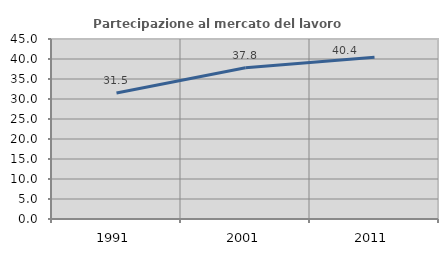
| Category | Partecipazione al mercato del lavoro  femminile |
|---|---|
| 1991.0 | 31.522 |
| 2001.0 | 37.833 |
| 2011.0 | 40.417 |